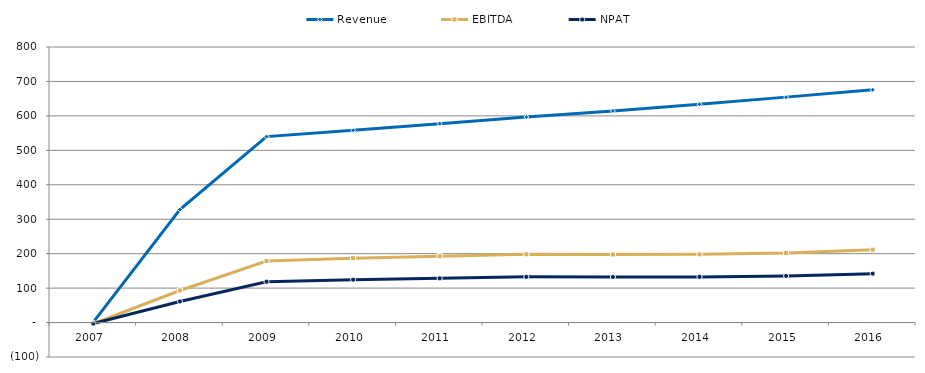
| Category | Revenue | EBITDA | NPAT |
|---|---|---|---|
| 2007  | 1.223 | -3.48 | -2.796 |
| 2008  | 328.282 | 93.064 | 61.296 |
| 2009  | 539.829 | 178.628 | 118.567 |
| 2010  | 558.123 | 186.989 | 124.42 |
| 2011  | 577.385 | 192.679 | 128.403 |
| 2012  | 596.751 | 198.192 | 132.665 |
| 2013  | 614.49 | 197.54 | 132.209 |
| 2014  | 633.711 | 198.074 | 132.583 |
| 2015  | 654.472 | 201.969 | 135.309 |
| 2016  | 675.733 | 211.541 | 142.01 |